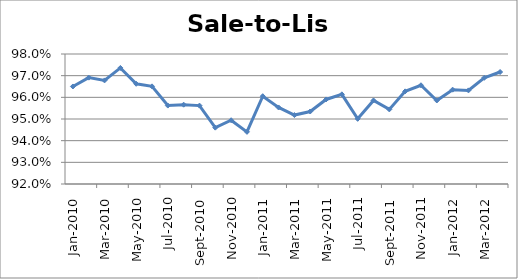
| Category | Series 0 |
|---|---|
| 2010-01-01 | 0.965 |
| 2010-02-01 | 0.969 |
| 2010-03-01 | 0.968 |
| 2010-04-01 | 0.974 |
| 2010-05-01 | 0.966 |
| 2010-06-01 | 0.965 |
| 2010-07-01 | 0.956 |
| 2010-08-01 | 0.957 |
| 2010-09-01 | 0.956 |
| 2010-10-01 | 0.946 |
| 2010-11-01 | 0.949 |
| 2010-12-01 | 0.944 |
| 2011-01-01 | 0.961 |
| 2011-02-01 | 0.955 |
| 2011-03-01 | 0.952 |
| 2011-04-01 | 0.953 |
| 2011-05-01 | 0.959 |
| 2011-06-01 | 0.961 |
| 2011-07-01 | 0.95 |
| 2011-08-01 | 0.959 |
| 2011-09-01 | 0.954 |
| 2011-10-01 | 0.963 |
| 2011-11-01 | 0.966 |
| 2011-12-01 | 0.959 |
| 2012-01-01 | 0.964 |
| 2012-02-01 | 0.963 |
| 2012-03-01 | 0.969 |
| 2012-04-01 | 0.972 |